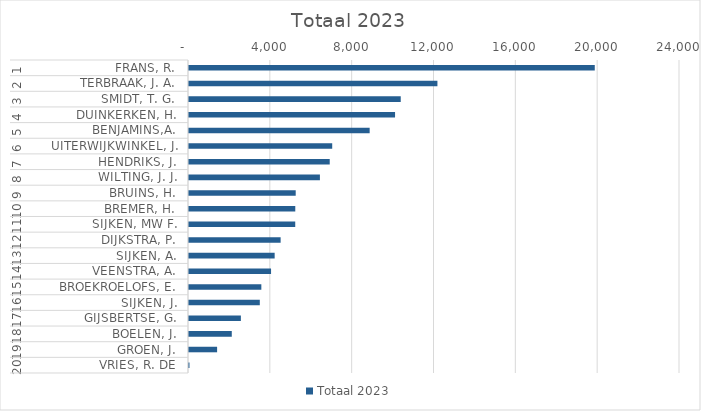
| Category | Totaal 2023 |
|---|---|
| 0 | 19834 |
| 1 | 12143 |
| 2 | 10350 |
| 3 | 10072 |
| 4 | 8831 |
| 5 | 7000 |
| 6 | 6879 |
| 7 | 6399 |
| 8 | 5216 |
| 9 | 5195 |
| 10 | 5193 |
| 11 | 4479 |
| 12 | 4187 |
| 13 | 4011 |
| 14 | 3536 |
| 15 | 3461 |
| 16 | 2536 |
| 17 | 2091 |
| 18 | 1374 |
| 19 | 23 |